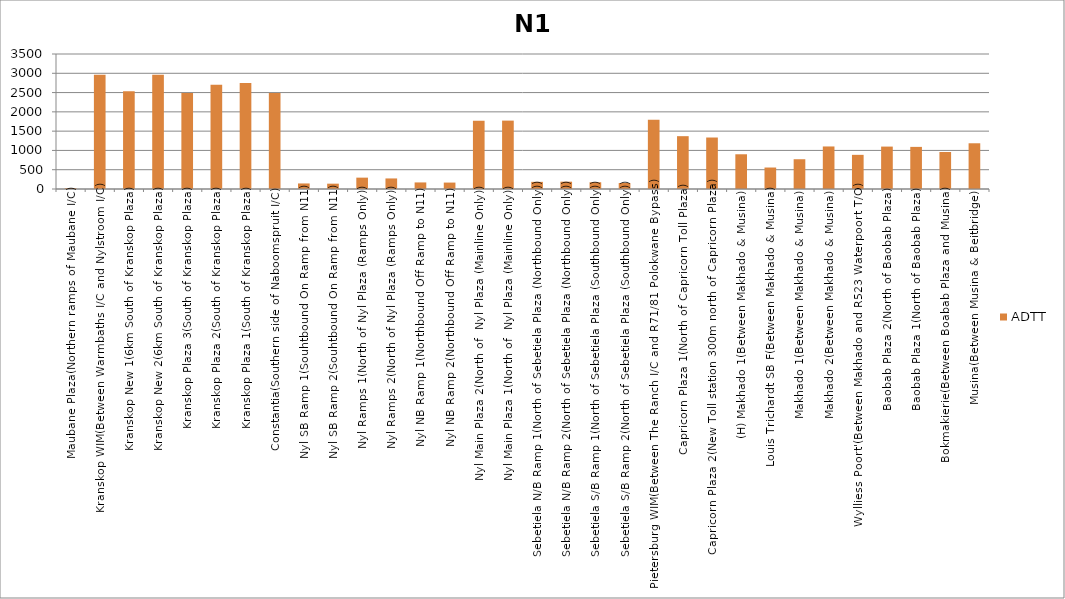
| Category | ADTT |
|---|---|
| Maubane Plaza(Northern ramps of Maubane I/C) | 20.989 |
| Kranskop WIM(Between Warmbaths I/C and Nylstroom I/C) | 2965.063 |
| Kranskop New 1(6km South of Kranskop Plaza) | 2537.327 |
| Kranskop New 2(6km South of Kranskop Plaza) | 2965.063 |
| Kranskop Plaza 3(South of Kranskop Plaza) | 2485.996 |
| Kranskop Plaza 2(South of Kranskop Plaza) | 2700.792 |
| Kranskop Plaza 1(South of Kranskop Plaza) | 2748.989 |
| Constantia(Southern side of Naboomspruit I/C) | 2491.143 |
| Nyl SB Ramp 1(Souhtbound On Ramp from N11) | 143.746 |
| Nyl SB Ramp 2(Souhtbound On Ramp from N11) | 138.006 |
| Nyl Ramps 1(North of Nyl Plaza (Ramps Only)) | 294.481 |
| Nyl Ramps 2(North of Nyl Plaza (Ramps Only)) | 273.699 |
| Nyl NB Ramp 1(Northbound Off Ramp to N11) | 170.37 |
| Nyl NB Ramp 2(Northbound Off Ramp to N11) | 166.439 |
| Nyl Main Plaza 2(North of  Nyl Plaza (Mainline Only)) | 1766.523 |
| Nyl Main Plaza 1(North of  Nyl Plaza (Mainline Only)) | 1772.948 |
| Sebetiela N/B Ramp 1(North of Sebetiela Plaza (Northbound Only)) | 185.309 |
| Sebetiela N/B Ramp 2(North of Sebetiela Plaza (Northbound Only)) | 189.635 |
| Sebetiela S/B Ramp 1(North of Sebetiela Plaza (Southbound Only)) | 174.738 |
| Sebetiela S/B Ramp 2(North of Sebetiela Plaza (Southbound Only)) | 155.561 |
| Pietersburg WIM(Between The Ranch I/C and R71/81 Polokwane Bypass) | 1794.783 |
| Capricorn Plaza 1(North of Capricorn Toll Plaza) | 1369.775 |
| Capricorn Plaza 2(New Toll station 300m north of Capricorn Plaza) | 1334.781 |
| (H) Makhado 1(Between Makhado & Musina) | 900.287 |
| Louis Trichardt SB F(Between Makhado & Musina) | 556.76 |
| Makhado 1(Between Makhado & Musina) | 771.648 |
| Makhado 2(Between Makhado & Musina) | 1102.769 |
| Wylliess Poort'(Between Makhado and R523 Waterpoort T/O) | 885.58 |
| Baobab Plaza 2(North of Baobab Plaza) | 1099.608 |
| Baobab Plaza 1(North of Baobab Plaza) | 1091.926 |
| Bokmakierie(Between Boabab Plaza and Musina) | 959.57 |
| Musina(Between Musina & Beitbridge) | 1185.514 |